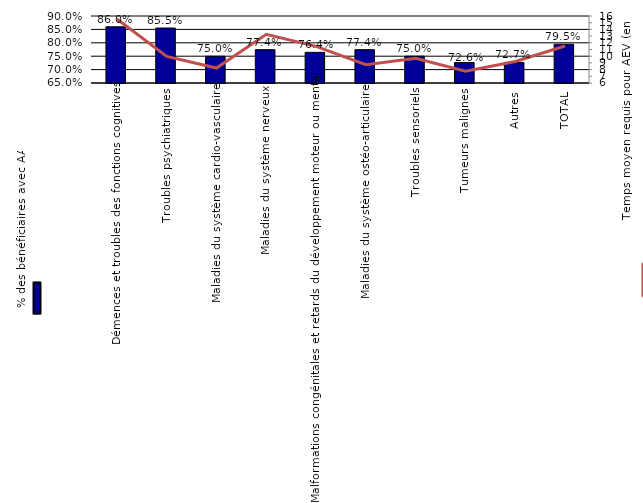
| Category | Series 0 |
|---|---|
| Démences et troubles des fonctions cognitives | 0.86 |
| Troubles psychiatriques | 0.855 |
| Maladies du système cardio-vasculaire | 0.75 |
| Maladies du système nerveux | 0.774 |
| Malformations congénitales et retards du développement moteur ou mental | 0.764 |
| Maladies du système ostéo-articulaire | 0.774 |
| Troubles sensoriels | 0.75 |
| Tumeurs malignes | 0.726 |
| Autres | 0.727 |
| TOTAL | 0.795 |